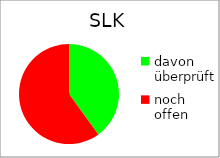
| Category | SLK |
|---|---|
| davon überprüft | 2 |
| noch offen | 3 |